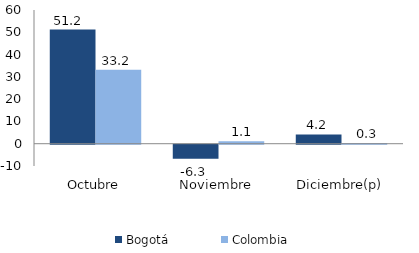
| Category | Bogotá | Colombia |
|---|---|---|
| Octubre | 51.229 | 33.239 |
| Noviembre | -6.26 | 1.129 |
| Diciembre(p) | 4.168 | 0.295 |